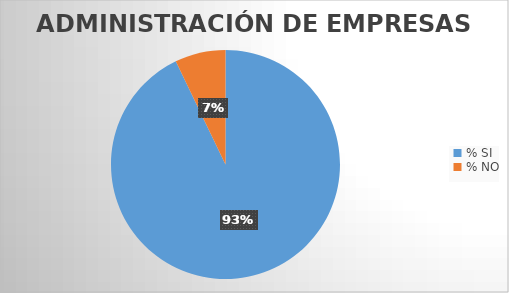
| Category | Series 0 |
|---|---|
| % SI | 93.299 |
| % NO | 7.182 |